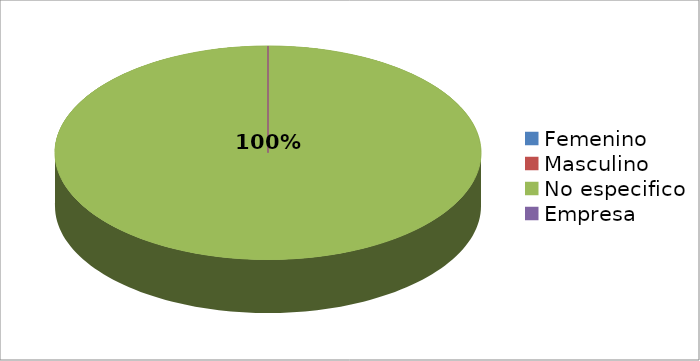
| Category | Series 0 |
|---|---|
| Femenino | 0 |
| Masculino | 0 |
| No especifico | 1 |
| Empresa | 0 |